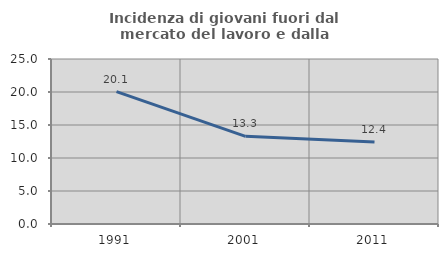
| Category | Incidenza di giovani fuori dal mercato del lavoro e dalla formazione  |
|---|---|
| 1991.0 | 20.064 |
| 2001.0 | 13.284 |
| 2011.0 | 12.435 |